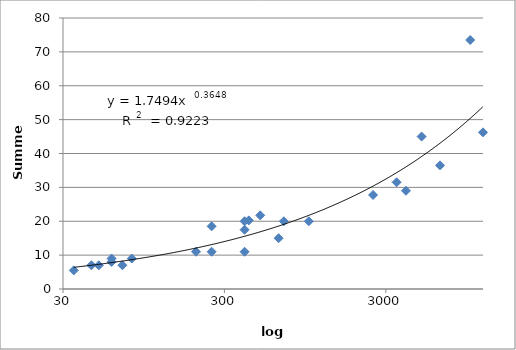
| Category | Series 0 |
|---|---|
| 35.0 | 5.5 |
| 45.0 | 7 |
| 50.0 | 7 |
| 60.0 | 8 |
| 60.0 | 9 |
| 70.0 | 7 |
| 80.0 | 9 |
| 200.0 | 11 |
| 250.0 | 11 |
| 250.0 | 18.5 |
| 400.0 | 20 |
| 400.0 | 11 |
| 400.0 | 17.5 |
| 425.0 | 20.25 |
| 500.0 | 21.75 |
| 650.0 | 15 |
| 700.0 | 20 |
| 1000.0 | 20 |
| 2500.0 | 27.75 |
| 3500.0 | 31.5 |
| 4000.0 | 29 |
| 5000.0 | 45 |
| 6500.0 | 36.5 |
| 10000.0 | 73.5 |
| 12000.0 | 46.25 |